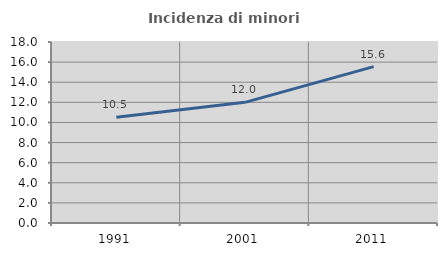
| Category | Incidenza di minori stranieri |
|---|---|
| 1991.0 | 10.526 |
| 2001.0 | 12 |
| 2011.0 | 15.556 |